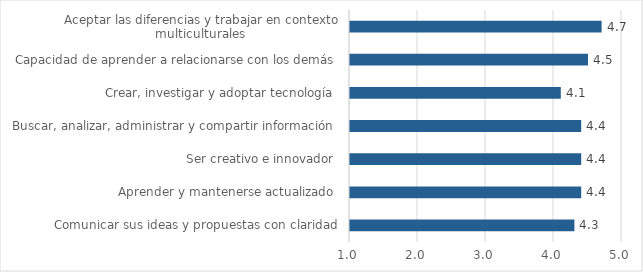
| Category | Series 5 | Promedio |
|---|---|---|
| Comunicar sus ideas y propuestas con claridad |  | 4.3 |
| Aprender y mantenerse actualizado  |  | 4.4 |
| Ser creativo e innovador  |  | 4.4 |
| Buscar, analizar, administrar y compartir información  |  | 4.4 |
| Crear, investigar y adoptar tecnología  |  | 4.1 |
| Capacidad de aprender a relacionarse con los demás  |  | 4.5 |
| Aceptar las diferencias y trabajar en contexto multiculturales  |  | 4.7 |